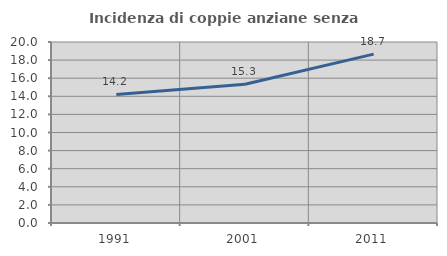
| Category | Incidenza di coppie anziane senza figli  |
|---|---|
| 1991.0 | 14.201 |
| 2001.0 | 15.327 |
| 2011.0 | 18.664 |